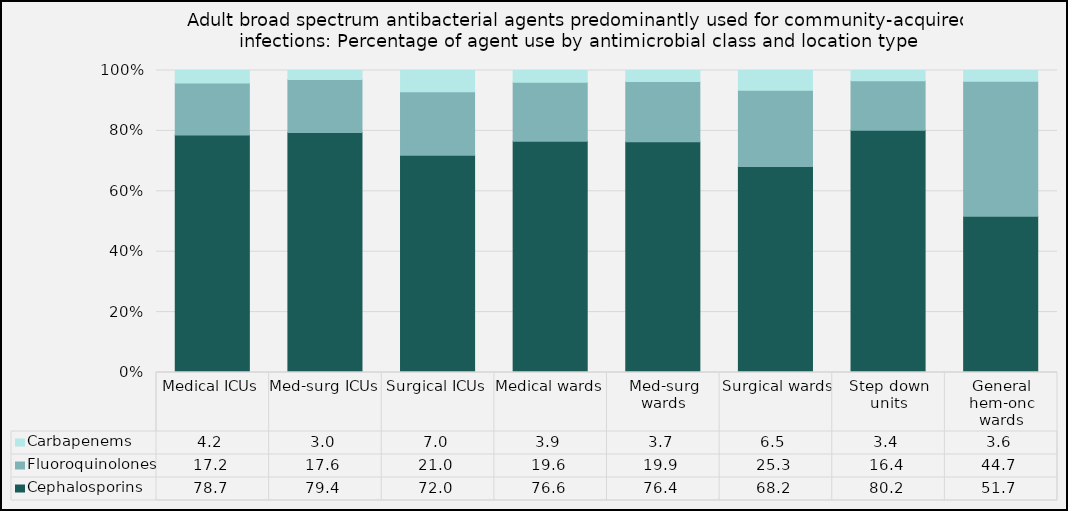
| Category | Cephalosporins | Fluoroquinolones | Carbapenems |
|---|---|---|---|
| Medical ICUs | 78.67 | 17.18 | 4.15 |
| Med-surg ICUs | 79.43 | 17.6 | 2.97 |
| Surgical ICUs | 71.97 | 21.03 | 7 |
| Medical wards | 76.56 | 19.59 | 3.85 |
| Med-surg wards | 76.4 | 19.93 | 3.67 |
| Surgical wards | 68.2 | 25.28 | 6.52 |
| Step down units | 80.2 | 16.38 | 3.42 |
| General hem-onc wards | 51.74 | 44.69 | 3.57 |